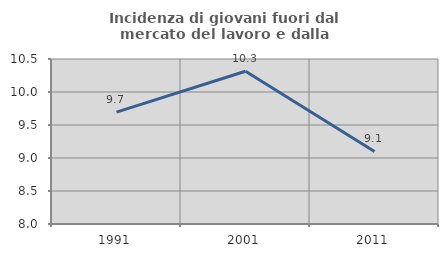
| Category | Incidenza di giovani fuori dal mercato del lavoro e dalla formazione  |
|---|---|
| 1991.0 | 9.696 |
| 2001.0 | 10.314 |
| 2011.0 | 9.1 |